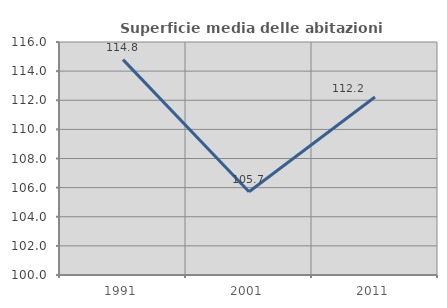
| Category | Superficie media delle abitazioni occupate |
|---|---|
| 1991.0 | 114.788 |
| 2001.0 | 105.72 |
| 2011.0 | 112.226 |